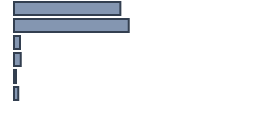
| Category | Percentatge |
|---|---|
| 0 | 44.318 |
| 1 | 47.803 |
| 2 | 2.5 |
| 3 | 2.803 |
| 4 | 0.833 |
| 5 | 1.742 |
| 6 | 0 |